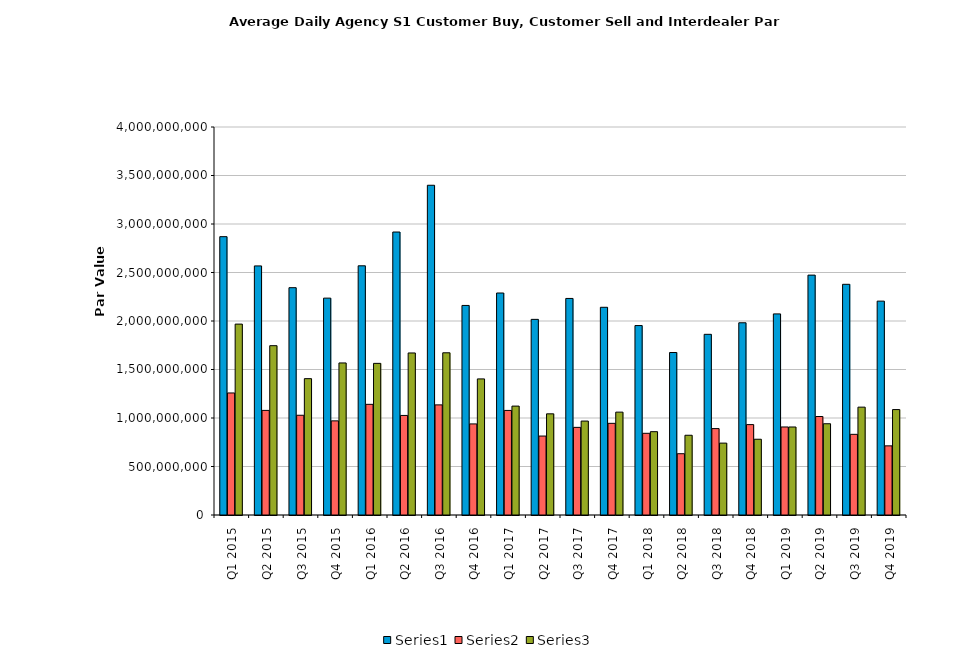
| Category | Series 0 | Series 1 | Series 2 |
|---|---|---|---|
| Q1 2015 | 2869493112.013 | 1258061076.446 | 1968039936.123 |
| Q2 2015 | 2567878881.385 | 1078331270.284 | 1745613692.501 |
| Q3 2015 | 2343524919.084 | 1028269042.485 | 1405607771.711 |
| Q4 2015 | 2235759044.268 | 970391456.275 | 1567503454.138 |
| Q1 2016 | 2568983491.342 | 1140791292.575 | 1563195402.666 |
| Q2 2016 | 2917274475.03 | 1026356965.009 | 1670545845.46 |
| Q3 2016 | 3399325753.161 | 1135281635.486 | 1672242018.388 |
| Q4 2016 | 2160327281.462 | 939002830.424 | 1403044499.216 |
| Q1 2017 | 2288549096.546 | 1078026778.301 | 1122683290.019 |
| Q2 2017 | 2016854071.308 | 813934660.294 | 1043002274.748 |
| Q3 2017 | 2232465339.305 | 903380763.894 | 968337710.99 |
| Q4 2017 | 2141415256.413 | 944944928.291 | 1060535846.087 |
| Q1 2018 | 1953070289.161 | 842225728.237 | 858924653.267 |
| Q2 2018 | 1675130757.897 | 631829280.343 | 822052220.44 |
| Q3 2018 | 1862749665.292 | 890746088.764 | 740998328.027 |
| Q4 2018 | 1981793898.347 | 931891609.234 | 780997176.341 |
| Q1 2019 | 2073261289.88 | 907510641.636 | 907260794.476 |
| Q2 2019 | 2473016544.594 | 1015360883.633 | 940855570.046 |
| Q3 2019 | 2378240723.661 | 831622963.177 | 1111864355.118 |
| Q4 2019 | 2204844278.563 | 712918478.978 | 1086841151.009 |